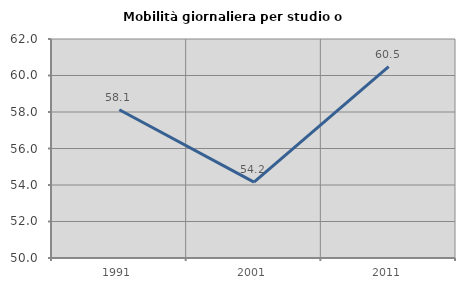
| Category | Mobilità giornaliera per studio o lavoro |
|---|---|
| 1991.0 | 58.123 |
| 2001.0 | 54.156 |
| 2011.0 | 60.484 |